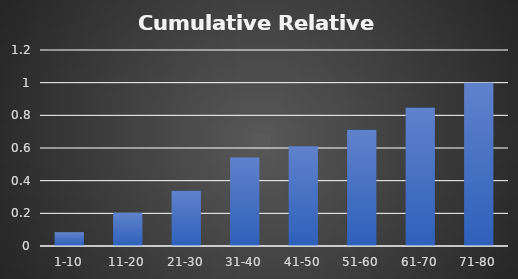
| Category | Cumulative Relative Frequency |
|---|---|
| 1-10 | 0.085 |
| 11-20 | 0.203 |
| 21-30 | 0.339 |
| 31-40 | 0.542 |
| 41-50 | 0.61 |
| 51-60 | 0.712 |
| 61-70 | 0.847 |
| 71-80 | 1 |